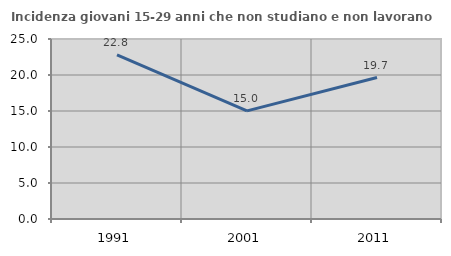
| Category | Incidenza giovani 15-29 anni che non studiano e non lavorano  |
|---|---|
| 1991.0 | 22.806 |
| 2001.0 | 15.014 |
| 2011.0 | 19.651 |